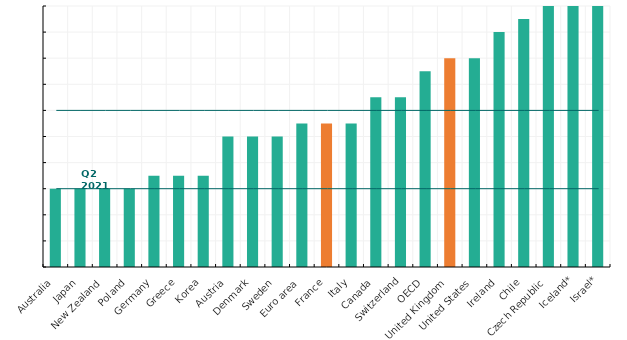
| Category | Column |
|---|---|
| Australia | 1.5 |
| Japan | 1.5 |
| New Zealand | 1.5 |
| Poland | 1.5 |
| Germany | 1.75 |
| Greece | 1.75 |
| Korea | 1.75 |
| Austria | 2.5 |
| Denmark | 2.5 |
| Sweden | 2.5 |
| Euro area | 2.75 |
| France | 2.75 |
| Italy | 2.75 |
| Canada | 3.25 |
| Switzerland | 3.25 |
| OECD | 3.75 |
| United Kingdom | 4 |
| United States | 4 |
| Ireland | 4.5 |
| Chile | 4.75 |
| Czech Republic | 5 |
| Iceland* | 5.25 |
| Israel* | 5.25 |